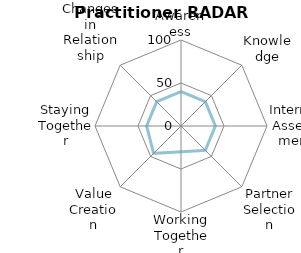
| Category | Series 1 |
|---|---|
| Awareness | 40 |
| Knowledge | 40 |
| Internal Assessment | 40 |
| Partner Selection | 40 |
| Working Together | 30 |
| Value Creation | 45 |
| Staying Together | 40 |
| Changes in Relationship | 40 |